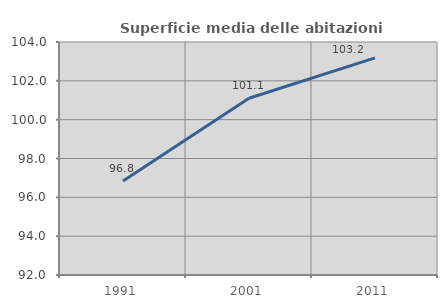
| Category | Superficie media delle abitazioni occupate |
|---|---|
| 1991.0 | 96.837 |
| 2001.0 | 101.105 |
| 2011.0 | 103.184 |